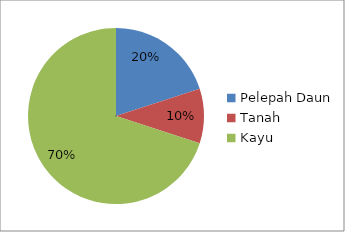
| Category | Persentase |
|---|---|
| Pelepah Daun | 0.2 |
| Tanah | 0.1 |
| Kayu | 0.7 |